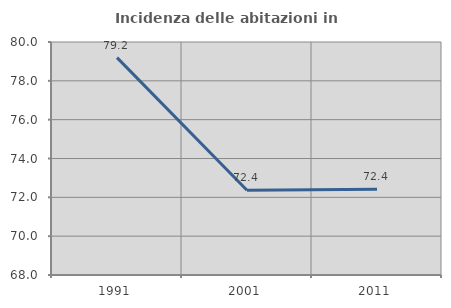
| Category | Incidenza delle abitazioni in proprietà  |
|---|---|
| 1991.0 | 79.198 |
| 2001.0 | 72.368 |
| 2011.0 | 72.42 |